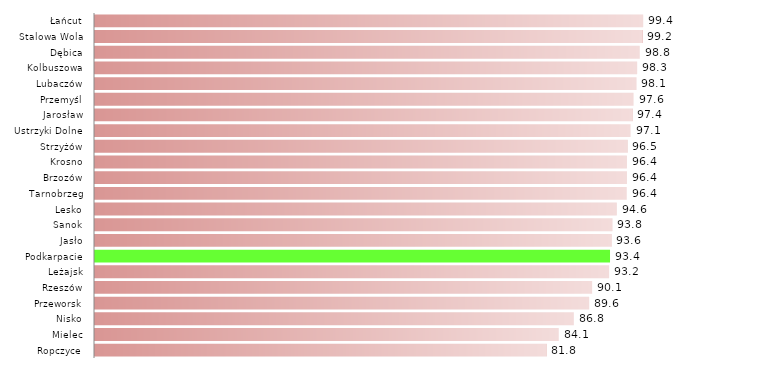
| Category | a |
|---|---|
| Ropczyce | 81.818 |
| Mielec | 84.064 |
| Nisko | 86.798 |
| Przeworsk | 89.562 |
| Rzeszów | 90.099 |
| Leżajsk | 93.182 |
| Podkarpacie | 93.357 |
| Jasło | 93.59 |
| Sanok | 93.75 |
| Lesko | 94.595 |
| Tarnobrzeg | 96.386 |
| Brzozów | 96.429 |
| Krosno | 96.429 |
| Strzyżów | 96.491 |
| Ustrzyki Dolne | 97.087 |
| Jarosław | 97.407 |
| Przemyśl | 97.628 |
| Lubaczów | 98.101 |
| Kolbuszowa | 98.261 |
| Dębica | 98.75 |
| Stalowa Wola | 99.237 |
| Łańcut | 99.351 |